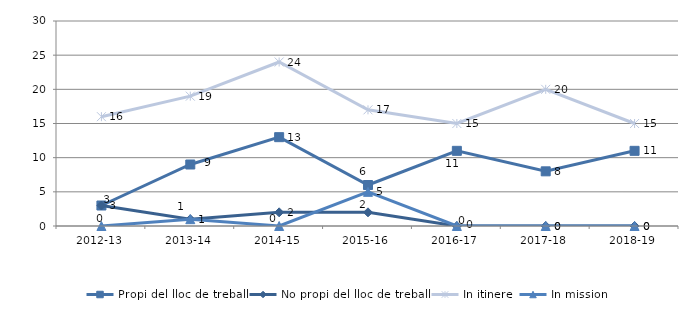
| Category | Propi del lloc de treball | No propi del lloc de treball | In itinere | In mission |
|---|---|---|---|---|
| 2012-13 | 3 | 3 | 16 | 0 |
| 2013-14 | 9 | 1 | 19 | 1 |
| 2014-15 | 13 | 2 | 24 | 0 |
| 2015-16 | 6 | 2 | 17 | 5 |
| 2016-17 | 11 | 0 | 15 | 0 |
| 2017-18 | 8 | 0 | 20 | 0 |
| 2018-19 | 11 | 0 | 15 | 0 |